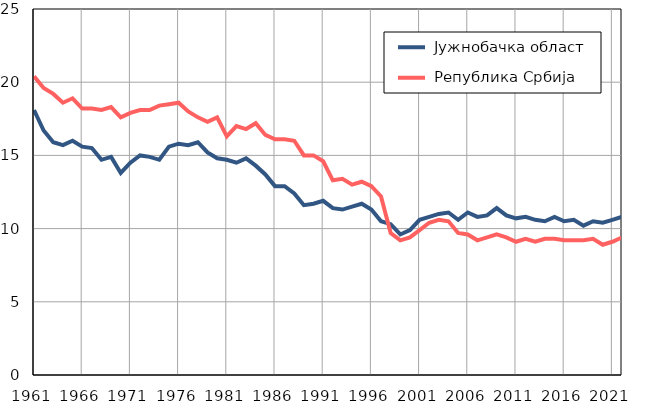
| Category |  Јужнобачка област |  Република Србија |
|---|---|---|
| 1961.0 | 18.1 | 20.4 |
| 1962.0 | 16.7 | 19.6 |
| 1963.0 | 15.9 | 19.2 |
| 1964.0 | 15.7 | 18.6 |
| 1965.0 | 16 | 18.9 |
| 1966.0 | 15.6 | 18.2 |
| 1967.0 | 15.5 | 18.2 |
| 1968.0 | 14.7 | 18.1 |
| 1969.0 | 14.9 | 18.3 |
| 1970.0 | 13.8 | 17.6 |
| 1971.0 | 14.5 | 17.9 |
| 1972.0 | 15 | 18.1 |
| 1973.0 | 14.9 | 18.1 |
| 1974.0 | 14.7 | 18.4 |
| 1975.0 | 15.6 | 18.5 |
| 1976.0 | 15.8 | 18.6 |
| 1977.0 | 15.7 | 18 |
| 1978.0 | 15.9 | 17.6 |
| 1979.0 | 15.2 | 17.3 |
| 1980.0 | 14.8 | 17.6 |
| 1981.0 | 14.7 | 16.3 |
| 1982.0 | 14.5 | 17 |
| 1983.0 | 14.8 | 16.8 |
| 1984.0 | 14.3 | 17.2 |
| 1985.0 | 13.7 | 16.4 |
| 1986.0 | 12.9 | 16.1 |
| 1987.0 | 12.9 | 16.1 |
| 1988.0 | 12.4 | 16 |
| 1989.0 | 11.6 | 15 |
| 1990.0 | 11.7 | 15 |
| 1991.0 | 11.9 | 14.6 |
| 1992.0 | 11.4 | 13.3 |
| 1993.0 | 11.3 | 13.4 |
| 1994.0 | 11.5 | 13 |
| 1995.0 | 11.7 | 13.2 |
| 1996.0 | 11.3 | 12.9 |
| 1997.0 | 10.5 | 12.2 |
| 1998.0 | 10.3 | 9.7 |
| 1999.0 | 9.6 | 9.2 |
| 2000.0 | 9.9 | 9.4 |
| 2001.0 | 10.6 | 9.9 |
| 2002.0 | 10.8 | 10.4 |
| 2003.0 | 11 | 10.6 |
| 2004.0 | 11.1 | 10.5 |
| 2005.0 | 10.6 | 9.7 |
| 2006.0 | 11.1 | 9.6 |
| 2007.0 | 10.8 | 9.2 |
| 2008.0 | 10.9 | 9.4 |
| 2009.0 | 11.4 | 9.6 |
| 2010.0 | 10.9 | 9.4 |
| 2011.0 | 10.7 | 9.1 |
| 2012.0 | 10.8 | 9.3 |
| 2013.0 | 10.6 | 9.1 |
| 2014.0 | 10.5 | 9.3 |
| 2015.0 | 10.8 | 9.3 |
| 2016.0 | 10.5 | 9.2 |
| 2017.0 | 10.6 | 9.2 |
| 2018.0 | 10.2 | 9.2 |
| 2019.0 | 10.5 | 9.3 |
| 2020.0 | 10.4 | 8.9 |
| 2021.0 | 10.6 | 9.1 |
| 2022.0 | 10.8 | 9.4 |